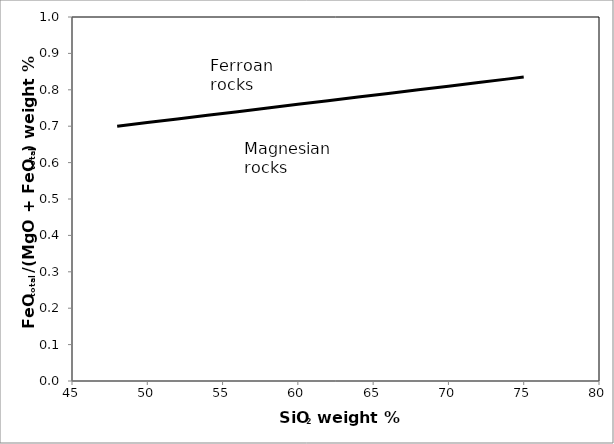
| Category | Series 0 |
|---|---|
| 48.0 | 0.7 |
| 50.0 | 0.71 |
| 52.0 | 0.72 |
| 54.0 | 0.73 |
| 56.0 | 0.74 |
| 58.0 | 0.75 |
| 60.0 | 0.76 |
| 62.0 | 0.77 |
| 64.0 | 0.78 |
| 66.0 | 0.79 |
| 68.0 | 0.8 |
| 70.0 | 0.81 |
| 72.0 | 0.82 |
| 74.0 | 0.83 |
| 75.0 | 0.835 |